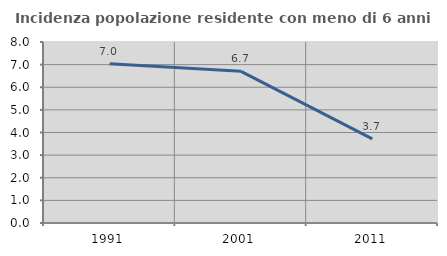
| Category | Incidenza popolazione residente con meno di 6 anni |
|---|---|
| 1991.0 | 7.038 |
| 2001.0 | 6.704 |
| 2011.0 | 3.72 |